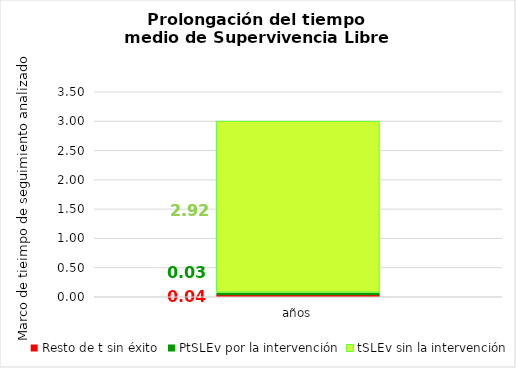
| Category | Resto de t sin éxito | PtSLEv por la intervención | tSLEv sin la intervención |
|---|---|---|---|
| años | 0.045 | 0.033 | 2.922 |